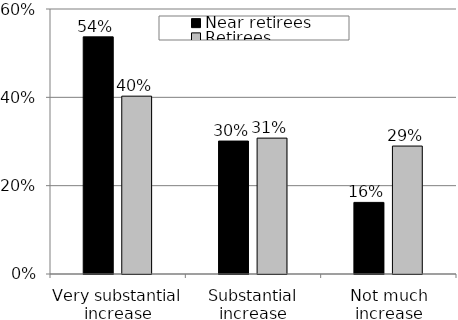
| Category | Near retirees | Retirees |
|---|---|---|
| Very substantial increase | 0.537 | 0.403 |
| Substantial increase | 0.301 | 0.308 |
| Not much increase | 0.162 | 0.29 |